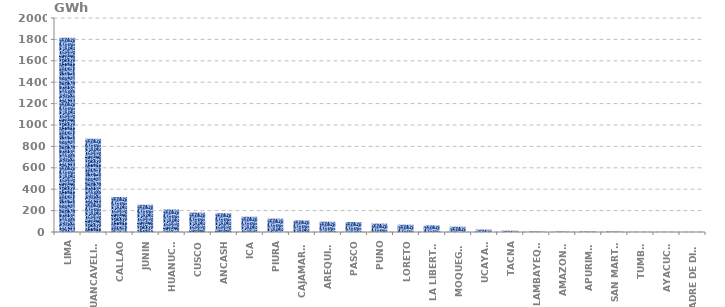
| Category | Series 0 |
|---|---|
| LIMA | 1815.224 |
| HUANCAVELICA | 872.25 |
| CALLAO | 327.212 |
| JUNIN | 254.603 |
| HUANUCO | 210.086 |
| CUSCO | 181.522 |
| ANCASH | 175.393 |
| ICA | 142.664 |
| PIURA | 124.944 |
| CAJAMARCA | 108.442 |
| AREQUIPA | 96.183 |
| PASCO | 93.222 |
| PUNO | 78.267 |
| LORETO | 68.02 |
| LA LIBERTAD | 61.502 |
| MOQUEGUA | 49.506 |
| UCAYALI | 22.867 |
| TACNA | 12.353 |
| LAMBAYEQUE | 5.23 |
| AMAZONAS | 4.715 |
| APURIMAC | 4.338 |
| SAN MARTÍN | 4.338 |
| TUMBES | 1.113 |
| AYACUCHO | 0.725 |
| MADRE DE DIOS | 0.15 |